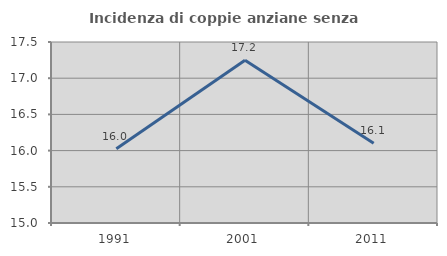
| Category | Incidenza di coppie anziane senza figli  |
|---|---|
| 1991.0 | 16.024 |
| 2001.0 | 17.248 |
| 2011.0 | 16.102 |